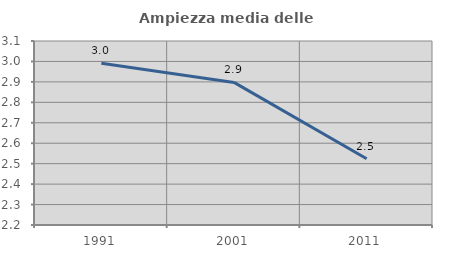
| Category | Ampiezza media delle famiglie |
|---|---|
| 1991.0 | 2.991 |
| 2001.0 | 2.897 |
| 2011.0 | 2.524 |